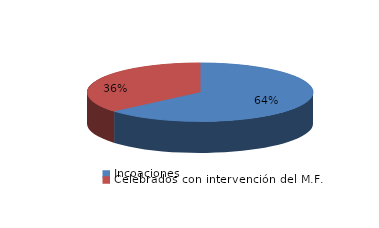
| Category | Series 0 |
|---|---|
| Incoaciones | 8026 |
| Celebrados con intervención del M.F. | 4582 |